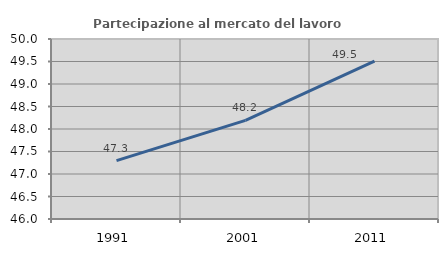
| Category | Partecipazione al mercato del lavoro  femminile |
|---|---|
| 1991.0 | 47.297 |
| 2001.0 | 48.191 |
| 2011.0 | 49.509 |